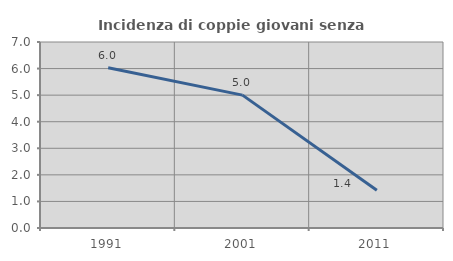
| Category | Incidenza di coppie giovani senza figli |
|---|---|
| 1991.0 | 6.032 |
| 2001.0 | 5 |
| 2011.0 | 1.418 |